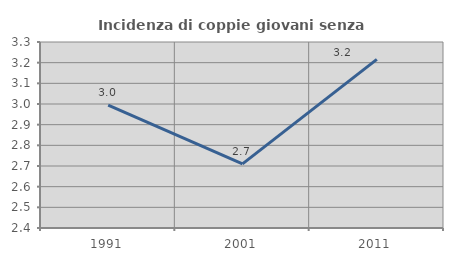
| Category | Incidenza di coppie giovani senza figli |
|---|---|
| 1991.0 | 2.994 |
| 2001.0 | 2.71 |
| 2011.0 | 3.216 |